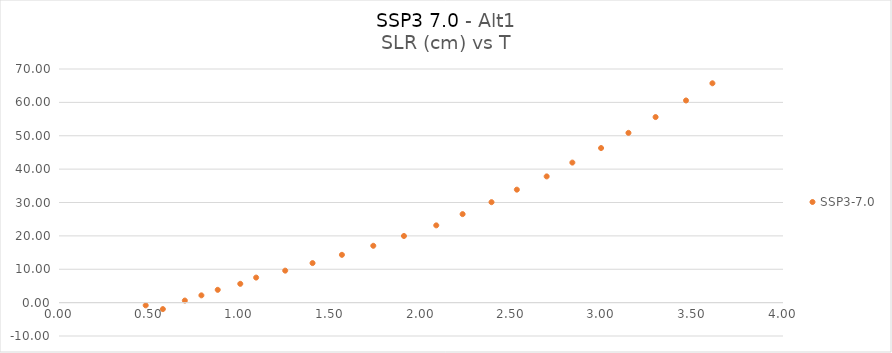
| Category | SSP3-7.0 |
|---|---|
| 0.573801925 | -1.941 |
| 0.479031654 | -0.818 |
| 0.695197934 | 0.621 |
| 0.786748548 | 2.18 |
| 0.877021499 | 3.834 |
| 1.001520332 | 5.633 |
| 1.089128948 | 7.505 |
| 1.249789297 | 9.582 |
| 1.40084264 | 11.846 |
| 1.563106609 | 14.321 |
| 1.736445254 | 17.03 |
| 1.905756517 | 19.966 |
| 2.084304689 | 23.151 |
| 2.229851962 | 26.518 |
| 2.38959776 | 30.097 |
| 2.529608217 | 33.846 |
| 2.694314026 | 37.817 |
| 2.836266075 | 41.961 |
| 2.994872826 | 46.315 |
| 3.14620165 | 50.863 |
| 3.296099987 | 55.601 |
| 3.46427976 | 60.57 |
| 3.610067907 | 65.721 |